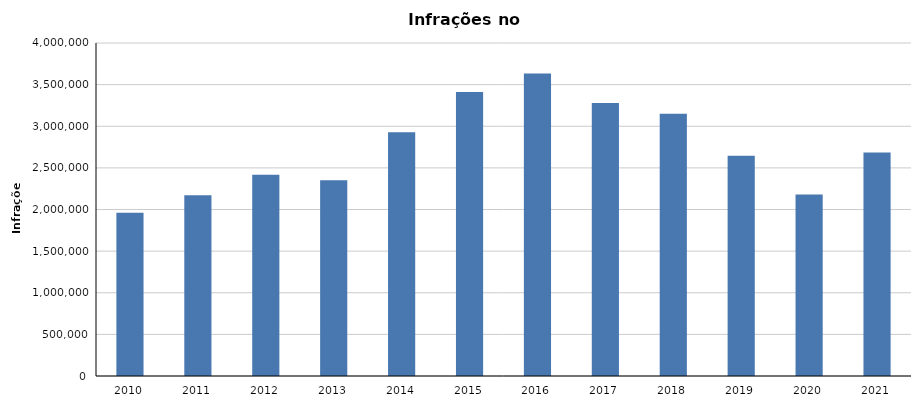
| Category | Infrações |
|---|---|
| 2010 | 1959697 |
| 2011 | 2172063 |
| 2012 | 2417716 |
| 2013 | 2351743 |
| 2014 | 2928670 |
| 2015 | 3410079 |
| 2016 | 3633176 |
| 2017 | 3278709 |
| 2018 | 3150520 |
| 2019 | 2644698 |
| 2020 | 2179277 |
| 2021 | 2685823 |